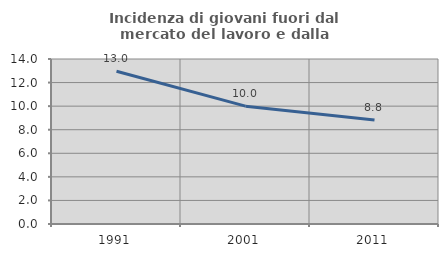
| Category | Incidenza di giovani fuori dal mercato del lavoro e dalla formazione  |
|---|---|
| 1991.0 | 12.963 |
| 2001.0 | 10 |
| 2011.0 | 8.824 |